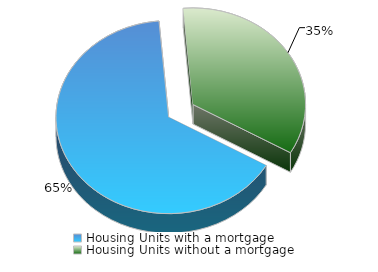
| Category | New York |
|---|---|
| Housing Units with a mortgage | 0.653 |
| Housing Units without a mortgage | 0.347 |